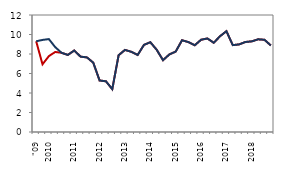
| Category | lower bound | median |
|---|---|---|
| "09 | 9.306 | 9.306 |
|  | 6.943 | 9.443 |
| 2010 | 7.78 | 9.53 |
|  | 8.207 | 8.707 |
|  | 8.123 | 8.123 |
|  | 7.907 | 7.907 |
| 2011 | 8.358 | 8.358 |
|  | 7.73 | 7.73 |
|  | 7.651 | 7.651 |
|  | 7.113 | 7.113 |
| 2012 | 5.284 | 5.284 |
|  | 5.201 | 5.201 |
|  | 4.396 | 4.396 |
|  | 7.875 | 7.875 |
| 2013 | 8.419 | 8.419 |
|  | 8.226 | 8.226 |
|  | 7.901 | 7.901 |
|  | 8.936 | 8.936 |
| 2014 | 9.208 | 9.208 |
|  | 8.437 | 8.437 |
|  | 7.366 | 7.366 |
|  | 7.956 | 7.956 |
| 2015 | 8.248 | 8.249 |
|  | 9.411 | 9.411 |
|  | 9.223 | 9.223 |
|  | 8.894 | 8.894 |
| 2016 | 9.461 | 9.461 |
|  | 9.595 | 9.595 |
|  | 9.152 | 9.152 |
|  | 9.83 | 9.83 |
| 2017 | 10.34 | 10.34 |
|  | 8.91 | 8.91 |
|  | 8.984 | 8.985 |
|  | 9.233 | 9.234 |
| 2018 | 9.297 | 9.297 |